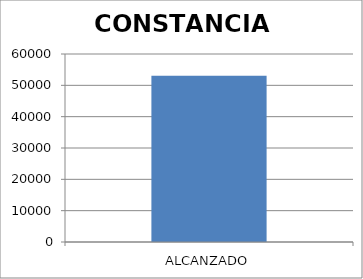
| Category | CONSTANCIAS  |
|---|---|
| ALCANZADO | 53075 |